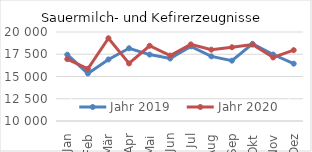
| Category | Jahr 2019 | Jahr 2020 |
|---|---|---|
| Jan | 17452.867 | 16950.591 |
| Feb | 15340.507 | 15867.048 |
| Mär | 16913.875 | 19295.878 |
| Apr | 18173.992 | 16466.043 |
| Mai | 17463.076 | 18454.896 |
| Jun | 17024.021 | 17351.05 |
| Jul | 18386.065 | 18607.452 |
| Aug | 17262.487 | 18016.798 |
| Sep | 16780.057 | 18286.461 |
| Okt | 18665.601 | 18584.078 |
| Nov | 17471.598 | 17142.087 |
| Dez | 16438.814 | 17958.508 |